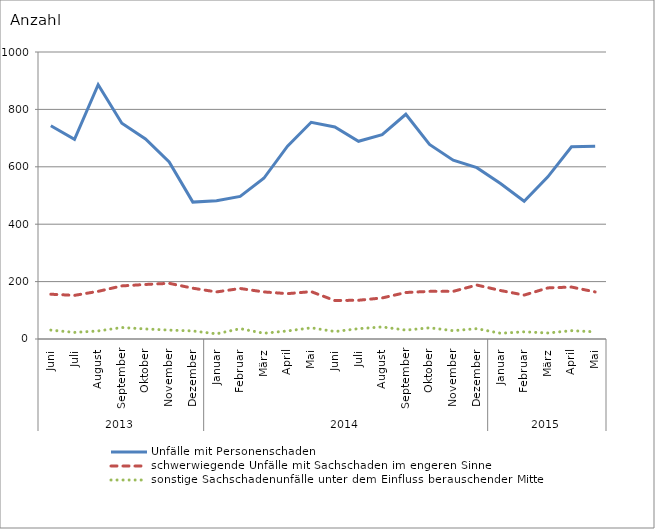
| Category | Unfälle mit Personenschaden | schwerwiegende Unfälle mit Sachschaden im engeren Sinne | sonstige Sachschadenunfälle unter dem Einfluss berauschender Mittel |
|---|---|---|---|
| 0 | 743 | 156 | 31 |
| 1 | 696 | 152 | 23 |
| 2 | 886 | 166 | 28 |
| 3 | 752 | 185 | 40 |
| 4 | 697 | 190 | 35 |
| 5 | 617 | 194 | 31 |
| 6 | 477 | 177 | 28 |
| 7 | 482 | 164 | 18 |
| 8 | 497 | 176 | 36 |
| 9 | 560 | 164 | 20 |
| 10 | 672 | 158 | 28 |
| 11 | 755 | 165 | 39 |
| 12 | 739 | 134 | 26 |
| 13 | 689 | 135 | 36 |
| 14 | 712 | 143 | 42 |
| 15 | 783 | 162 | 31 |
| 16 | 678 | 166 | 39 |
| 17 | 623 | 166 | 29 |
| 18 | 597 | 188 | 36 |
| 19 | 542 | 169 | 20 |
| 20 | 480 | 153 | 25 |
| 21 | 565 | 178 | 21 |
| 22 | 670 | 181 | 29 |
| 23 | 672 | 164 | 25 |